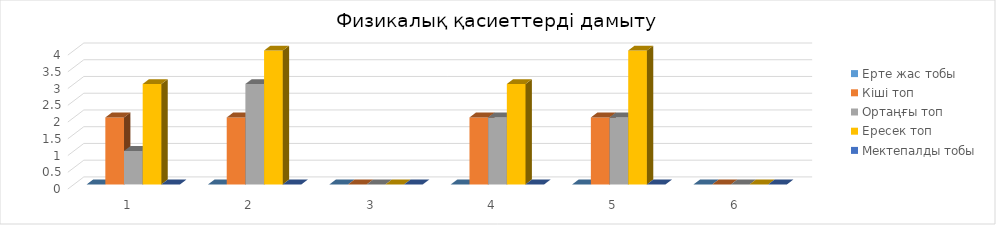
| Category | Ерте жас тобы  | Кіші топ | Ортаңғы топ | Ересек топ | Мектепалды тобы |
|---|---|---|---|---|---|
| 0 | 0 | 2 | 1 | 3 | 0 |
| 1 | 0 | 2 | 3 | 4 | 0 |
| 2 | 0 | 0 | 0 | 0 | 0 |
| 3 | 0 | 2 | 2 | 3 | 0 |
| 4 | 0 | 2 | 2 | 4 | 0 |
| 5 | 0 | 0 | 0 | 0 | 0 |